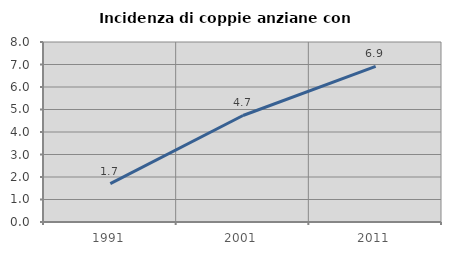
| Category | Incidenza di coppie anziane con figli |
|---|---|
| 1991.0 | 1.705 |
| 2001.0 | 4.734 |
| 2011.0 | 6.918 |